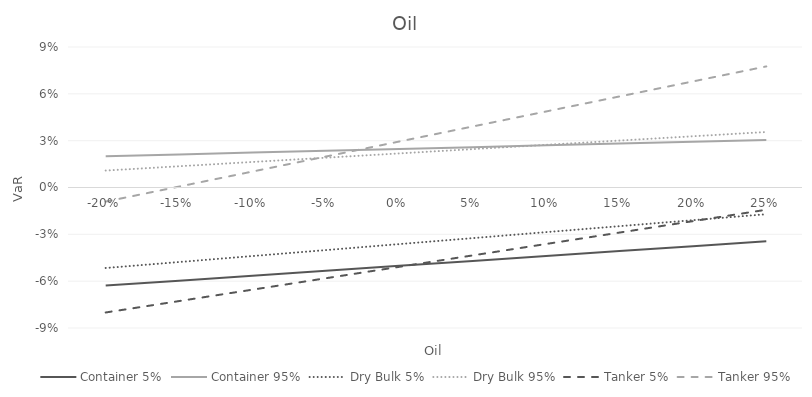
| Category | Container 5% | Container 95% | Dry Bulk 5% | Dry Bulk 95% | Tanker 5% | Tanker 95% |
|---|---|---|---|---|---|---|
| -0.2 | -0.063 | 0.02 | -0.052 | 0.011 | -0.08 | -0.009 |
| -0.15000000000000002 | -0.06 | 0.021 | -0.048 | 0.014 | -0.073 | 0.001 |
| -0.10000000000000002 | -0.057 | 0.022 | -0.044 | 0.016 | -0.065 | 0.01 |
| -0.05000000000000002 | -0.053 | 0.024 | -0.04 | 0.019 | -0.058 | 0.02 |
| 0.0 | -0.05 | 0.025 | -0.036 | 0.022 | -0.051 | 0.029 |
| 0.05 | -0.047 | 0.026 | -0.032 | 0.025 | -0.043 | 0.039 |
| 0.1 | -0.044 | 0.027 | -0.029 | 0.027 | -0.036 | 0.049 |
| 0.15000000000000002 | -0.041 | 0.028 | -0.025 | 0.03 | -0.029 | 0.058 |
| 0.2 | -0.038 | 0.029 | -0.021 | 0.033 | -0.022 | 0.068 |
| 0.25 | -0.034 | 0.03 | -0.017 | 0.036 | -0.014 | 0.078 |